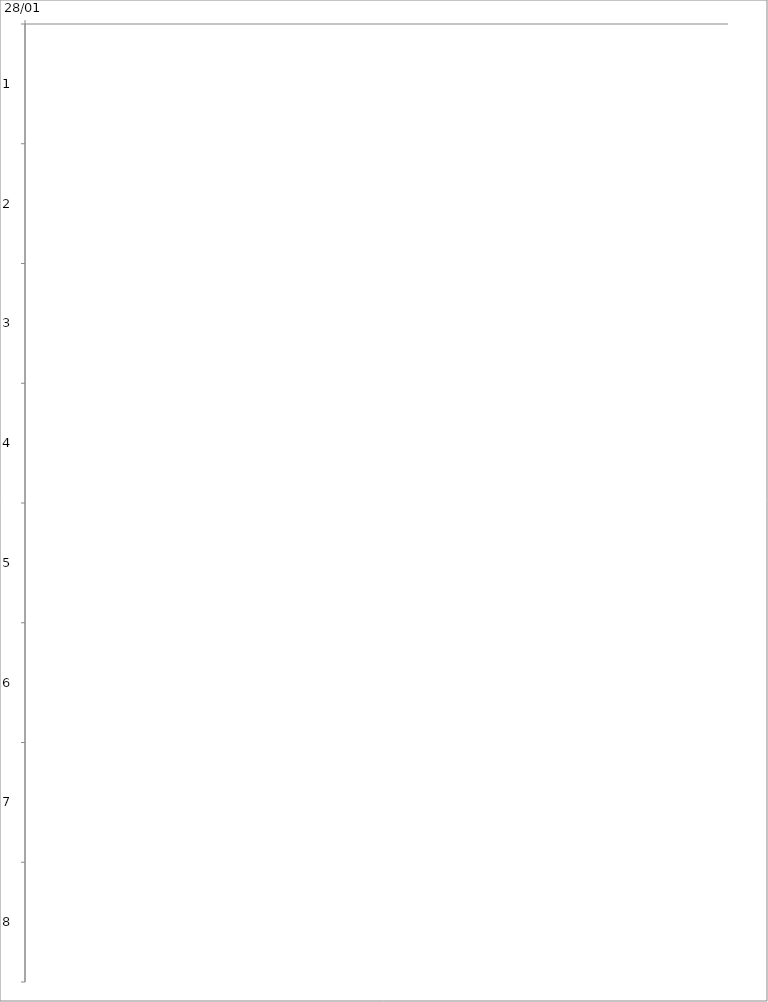
| Category | Fecha de inicio | DURACIÓN |
|---|---|---|
| 0 | 1/28/16 | 11 |
| 1 | 1/28/16 | 11 |
| 2 | 2/15/16 | 63 |
| 3 | 2/9/16 | 20 |
| 4 | 2/29/16 | 18 |
| 5 | 2/15/16 | 28 |
| 6 | 3/18/16 | 28 |
| 7 | 5/2/16 | 221 |